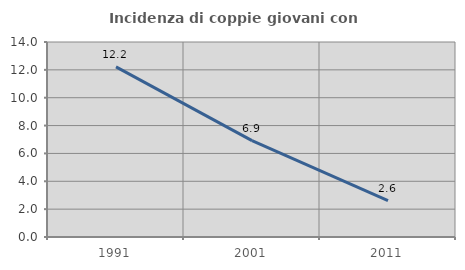
| Category | Incidenza di coppie giovani con figli |
|---|---|
| 1991.0 | 12.217 |
| 2001.0 | 6.915 |
| 2011.0 | 2.614 |